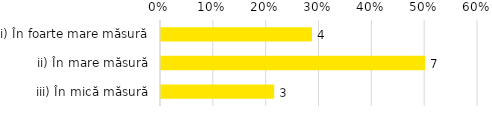
| Category | Total |
|---|---|
| i) În foarte mare măsură | 0.286 |
| ii) În mare măsură | 0.5 |
| iii) În mică măsură | 0.214 |